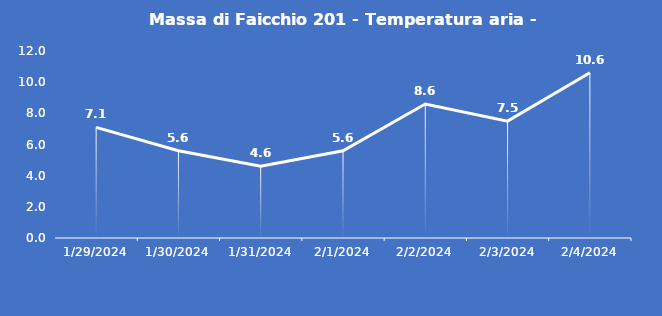
| Category | Massa di Faicchio 201 - Temperatura aria - Grezzo (°C) |
|---|---|
| 1/29/24 | 7.1 |
| 1/30/24 | 5.6 |
| 1/31/24 | 4.6 |
| 2/1/24 | 5.6 |
| 2/2/24 | 8.6 |
| 2/3/24 | 7.5 |
| 2/4/24 | 10.6 |